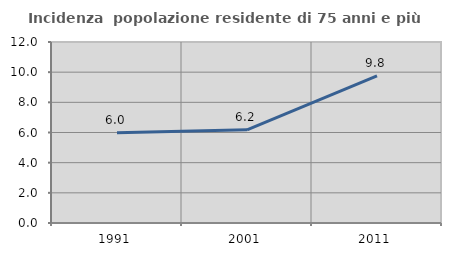
| Category | Incidenza  popolazione residente di 75 anni e più |
|---|---|
| 1991.0 | 5.988 |
| 2001.0 | 6.176 |
| 2011.0 | 9.751 |